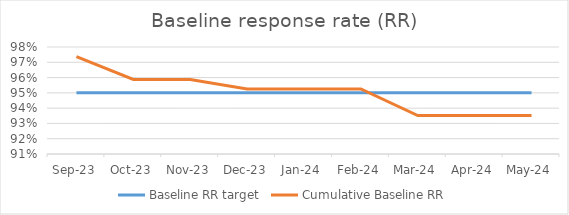
| Category | Baseline RR target | Cumulative Baseline RR |
|---|---|---|
| Sep-23 | 0.95 | 0.974 |
| Oct-23 | 0.95 | 0.959 |
| Nov-23 | 0.95 | 0.959 |
| Dec-23 | 0.95 | 0.953 |
| Jan-24 | 0.95 | 0.953 |
| Feb-24 | 0.95 | 0.953 |
| Mar-24 | 0.95 | 0.935 |
| Apr-24 | 0.95 | 0.935 |
| May-24 | 0.95 | 0.935 |